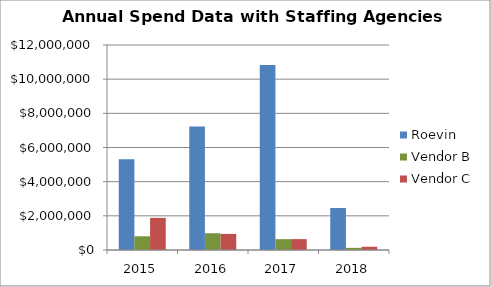
| Category | Roevin  | Vendor B | Vendor C |
|---|---|---|---|
| 2015.0 | 5306331.57 | 802076.26 | 1880722.08 |
| 2016.0 | 7222911.42 | 981248.65 | 940204.61 |
| 2017.0 | 10822998.08 | 635047.41 | 637539.8 |
| 2018.0 | 2459181.79 | 124899.08 | 190534.51 |